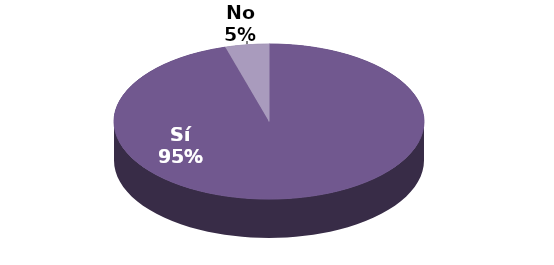
| Category | Series 1 |
|---|---|
| Sí | 21 |
| No | 1 |